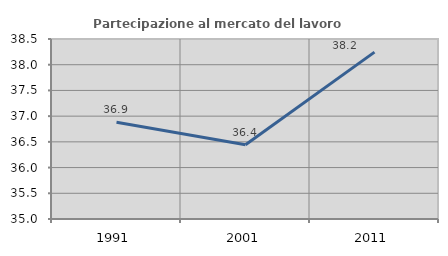
| Category | Partecipazione al mercato del lavoro  femminile |
|---|---|
| 1991.0 | 36.881 |
| 2001.0 | 36.443 |
| 2011.0 | 38.244 |